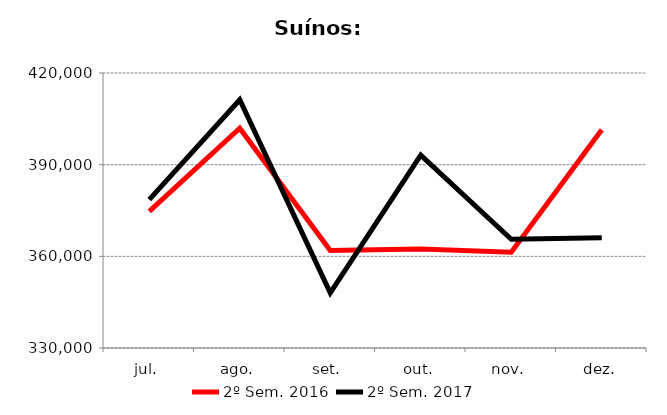
| Category | 2º Sem. 2016 | 2º Sem. 2017 |
|---|---|---|
| jul. | 374708 | 378576 |
| ago. | 401937 | 411237 |
| set. | 361916 | 348069 |
| out. | 362387 | 393115 |
| nov. | 361376 | 365561 |
| dez. | 401463 | 366094 |